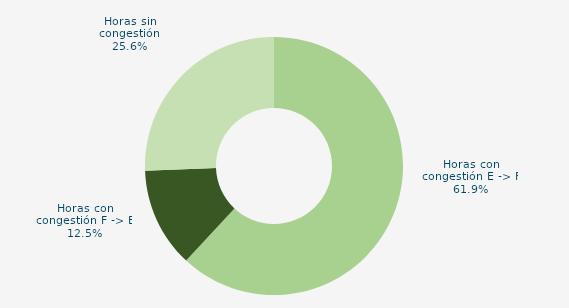
| Category | Horas con congestión E -> F |
|---|---|
| Horas con congestión E -> F | 61.925 |
| Horas con congestión F -> E | 12.5 |
| Horas sin congestión | 25.575 |